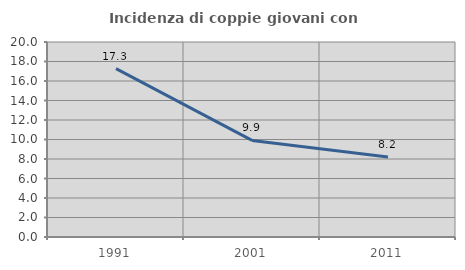
| Category | Incidenza di coppie giovani con figli |
|---|---|
| 1991.0 | 17.275 |
| 2001.0 | 9.904 |
| 2011.0 | 8.201 |